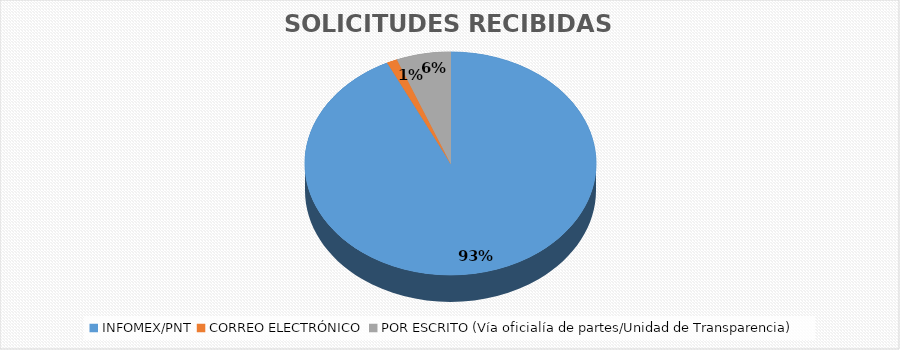
| Category | Series 0 |
|---|---|
| INFOMEX/PNT | 11830 |
| CORREO ELECTRÓNICO | 148 |
| POR ESCRITO (Vía oficialía de partes/Unidad de Transparencia) | 765 |